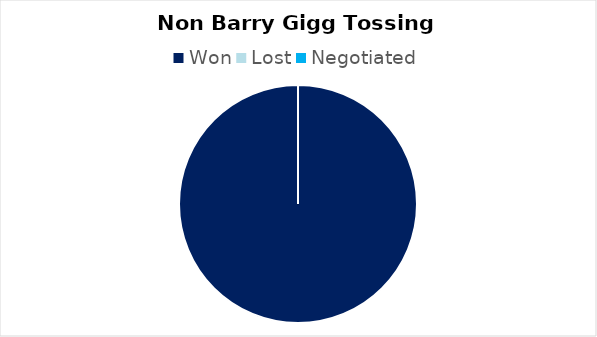
| Category | Non Barry Gigg |
|---|---|
| Won | 3 |
| Lost | 0 |
| Negotiated | 0 |